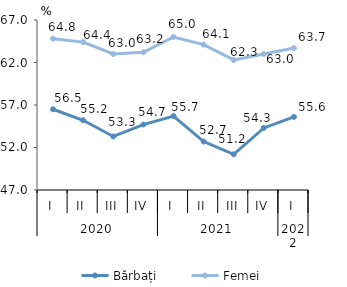
| Category | Bărbați | Femei |
|---|---|---|
| 0 | 56.5 | 64.8 |
| 1 | 55.2 | 64.4 |
| 2 | 53.3 | 63 |
| 3 | 54.7 | 63.2 |
| 4 | 55.7 | 65 |
| 5 | 52.7 | 64.1 |
| 6 | 51.2 | 62.3 |
| 7 | 54.3 | 63 |
| 8 | 55.6 | 63.7 |